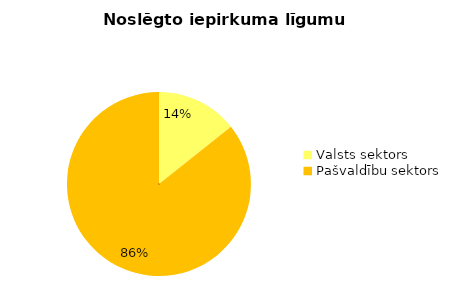
| Category | Noslēgto iepirkuma līgumu skaits |
|---|---|
| Valsts sektors | 10 |
| Pašvaldību sektors | 60 |